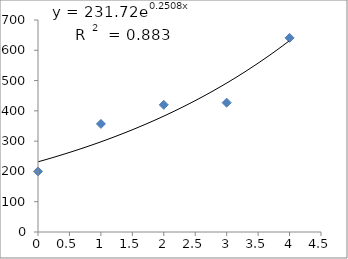
| Category | Series 0 |
|---|---|
| 0.0 | 200 |
| 1.0 | 357 |
| 2.0 | 420 |
| 3.0 | 427 |
| 4.0 | 641 |